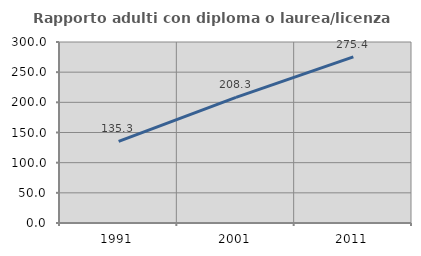
| Category | Rapporto adulti con diploma o laurea/licenza media  |
|---|---|
| 1991.0 | 135.253 |
| 2001.0 | 208.259 |
| 2011.0 | 275.414 |